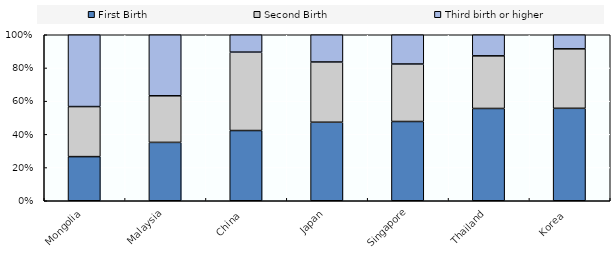
| Category | First Birth | Second Birth | Third birth or higher |
|---|---|---|---|
| Mongolia | 26.583 | 30.152 | 43.265 |
| Malaysia | 35.2 | 28.1 | 36.8 |
| China  | 42.3 | 47.22 | 10.47 |
| Japan | 47.3 | 36.3 | 16.4 |
| Singapore | 47.7 | 34.6 | 17.6 |
| Thailand | 55.6 | 31.7 | 12.7 |
| Korea  | 55.662 | 35.811 | 8.476 |